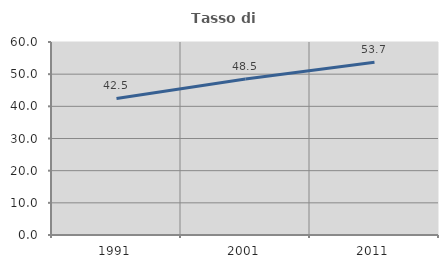
| Category | Tasso di occupazione   |
|---|---|
| 1991.0 | 42.459 |
| 2001.0 | 48.519 |
| 2011.0 | 53.672 |